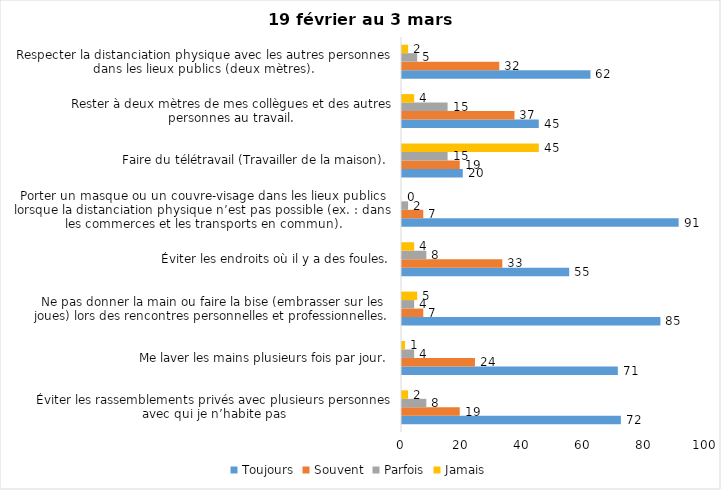
| Category | Toujours | Souvent | Parfois | Jamais |
|---|---|---|---|---|
| Éviter les rassemblements privés avec plusieurs personnes avec qui je n’habite pas | 72 | 19 | 8 | 2 |
| Me laver les mains plusieurs fois par jour. | 71 | 24 | 4 | 1 |
| Ne pas donner la main ou faire la bise (embrasser sur les joues) lors des rencontres personnelles et professionnelles. | 85 | 7 | 4 | 5 |
| Éviter les endroits où il y a des foules. | 55 | 33 | 8 | 4 |
| Porter un masque ou un couvre-visage dans les lieux publics lorsque la distanciation physique n’est pas possible (ex. : dans les commerces et les transports en commun). | 91 | 7 | 2 | 0 |
| Faire du télétravail (Travailler de la maison). | 20 | 19 | 15 | 45 |
| Rester à deux mètres de mes collègues et des autres personnes au travail. | 45 | 37 | 15 | 4 |
| Respecter la distanciation physique avec les autres personnes dans les lieux publics (deux mètres). | 62 | 32 | 5 | 2 |